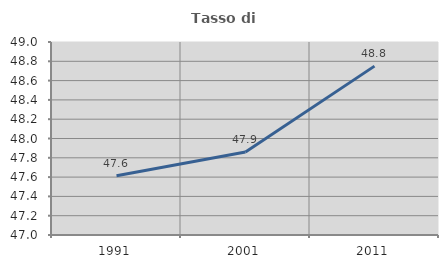
| Category | Tasso di occupazione   |
|---|---|
| 1991.0 | 47.613 |
| 2001.0 | 47.861 |
| 2011.0 | 48.75 |